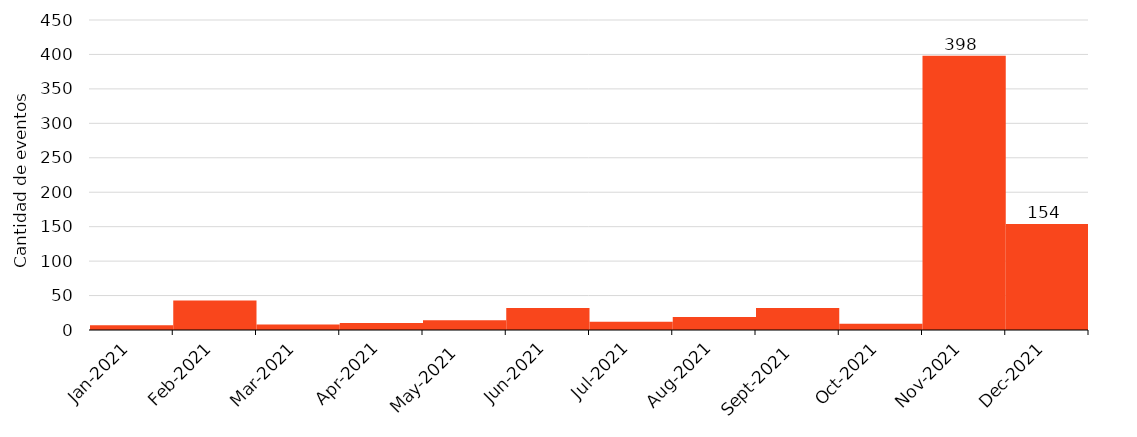
| Category | Falla No Envío de Lectura |
|---|---|
| 2021-01-01 | 7 |
| 2021-02-01 | 43 |
| 2021-03-01 | 8 |
| 2021-04-01 | 10 |
| 2021-05-01 | 14 |
| 2021-06-01 | 32 |
| 2021-07-01 | 12 |
| 2021-08-01 | 19 |
| 2021-09-01 | 32 |
| 2021-10-01 | 9 |
| 2021-11-01 | 398 |
| 2021-12-01 | 154 |